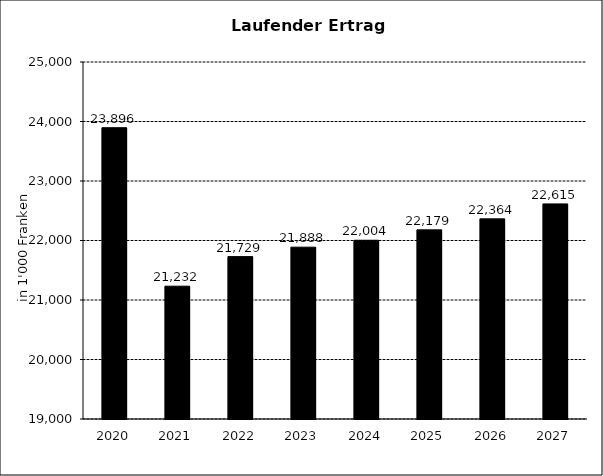
| Category | Laufender Ertrag |
|---|---|
| 2020.0 | 23896 |
| 2021.0 | 21232 |
| 2022.0 | 21729 |
| 2023.0 | 21887.995 |
| 2024.0 | 22004.103 |
| 2025.0 | 22178.578 |
| 2026.0 | 22363.517 |
| 2027.0 | 22615 |